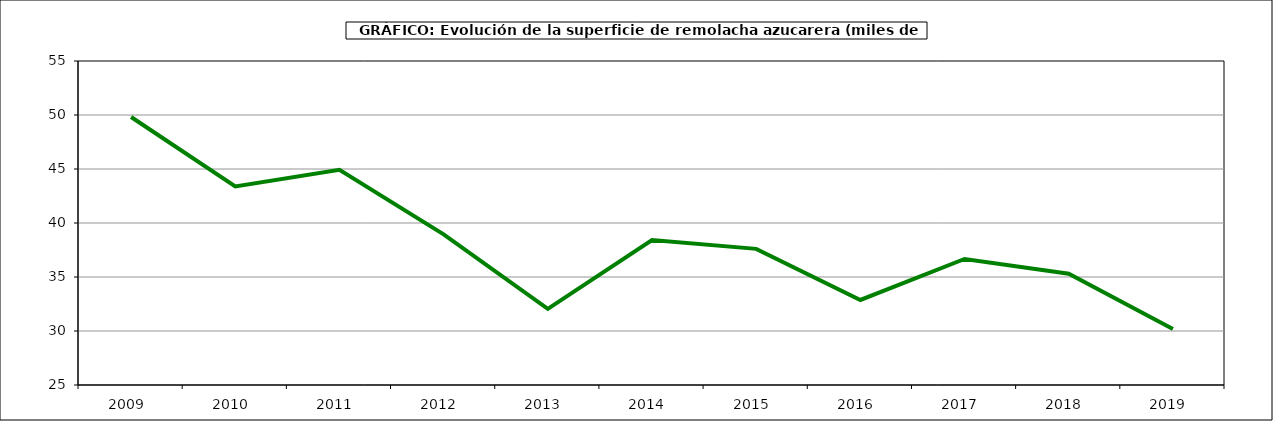
| Category | Superficie |
|---|---|
| 2009.0 | 49.813 |
| 2010.0 | 43.382 |
| 2011.0 | 44.931 |
| 2012.0 | 38.952 |
| 2013.0 | 32.052 |
| 2014.0 | 38.414 |
| 2015.0 | 37.605 |
| 2016.0 | 32.874 |
| 2017.0 | 36.671 |
| 2018.0 | 35.297 |
| 2019.0 | 30.177 |